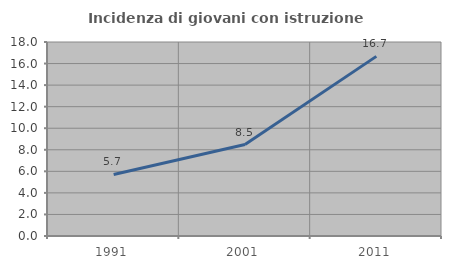
| Category | Incidenza di giovani con istruzione universitaria |
|---|---|
| 1991.0 | 5.714 |
| 2001.0 | 8.483 |
| 2011.0 | 16.667 |